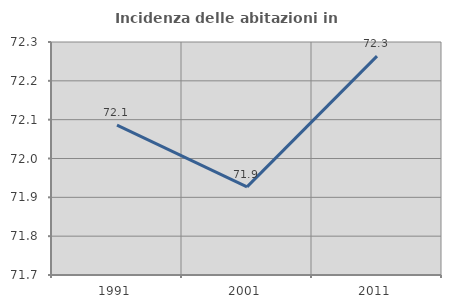
| Category | Incidenza delle abitazioni in proprietà  |
|---|---|
| 1991.0 | 72.086 |
| 2001.0 | 71.927 |
| 2011.0 | 72.264 |